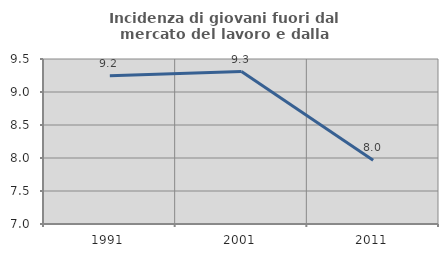
| Category | Incidenza di giovani fuori dal mercato del lavoro e dalla formazione  |
|---|---|
| 1991.0 | 9.247 |
| 2001.0 | 9.31 |
| 2011.0 | 7.965 |